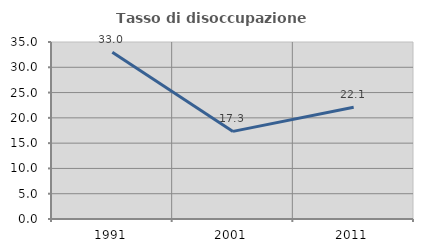
| Category | Tasso di disoccupazione giovanile  |
|---|---|
| 1991.0 | 32.973 |
| 2001.0 | 17.323 |
| 2011.0 | 22.105 |